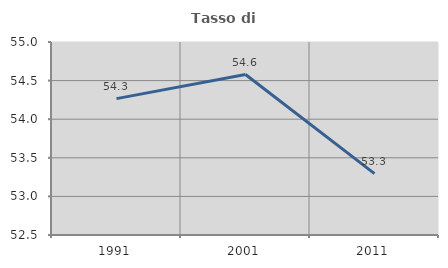
| Category | Tasso di occupazione   |
|---|---|
| 1991.0 | 54.267 |
| 2001.0 | 54.578 |
| 2011.0 | 53.295 |